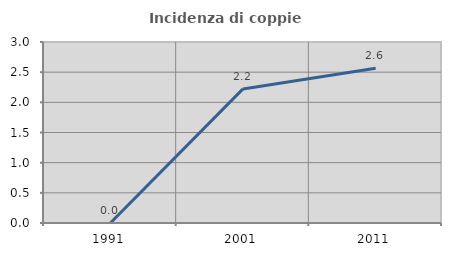
| Category | Incidenza di coppie miste |
|---|---|
| 1991.0 | 0 |
| 2001.0 | 2.222 |
| 2011.0 | 2.564 |